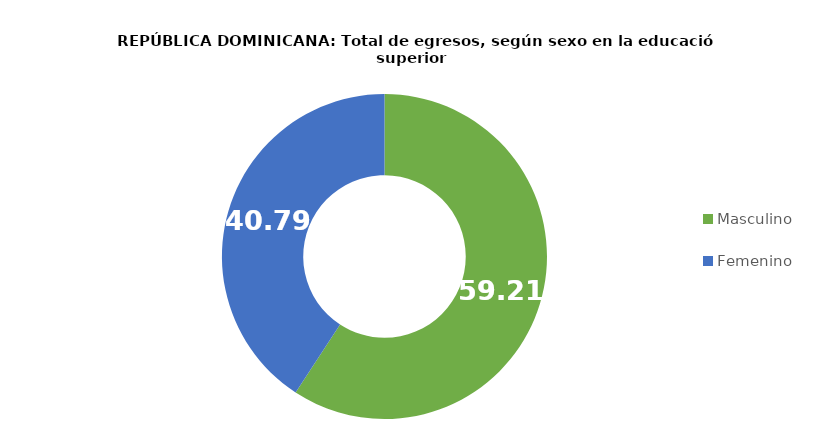
| Category | Series 0 |
|---|---|
| Masculino | 59.211 |
| Femenino | 40.789 |